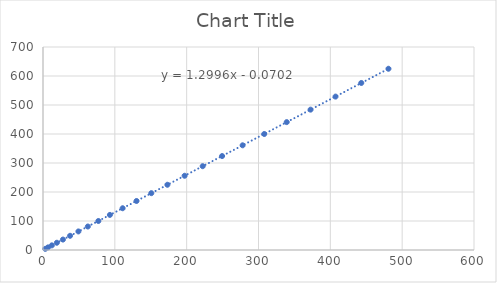
| Category | Series 0 |
|---|---|
| 3.0976 | 4 |
| 6.9696 | 9 |
| 12.3201 | 16 |
| 19.2721 | 25 |
| 27.7729 | 36 |
| 37.6996 | 49 |
| 49.2804 | 64 |
| 62.41 | 81 |
| 77.0884 | 100 |
| 93.1225 | 121 |
| 110.8809 | 144 |
| 130.1881 | 169 |
| 150.7984 | 196 |
| 173.1856 | 225 |
| 197.1216 | 256 |
| 222.3081 | 289 |
| 249.3241 | 324 |
| 277.8889 | 361 |
| 308.0025 | 400 |
| 339.2964000000001 | 441 |
| 372.49 | 484 |
| 407.2324 | 529 |
| 443.1025 | 576 |
| 480.9249 | 625 |